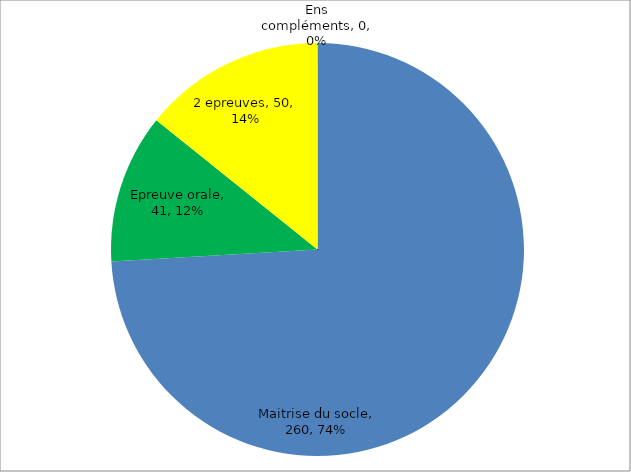
| Category | Series 0 |
|---|---|
| Maitrise du socle | 260 |
| Epreuve orale | 41 |
| 2 epreuves | 50 |
| Ens compléments | 0 |